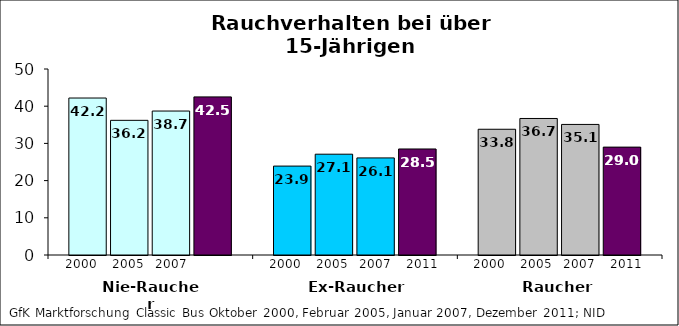
| Category | 2000 | 2005 | 2007 | 2011 |
|---|---|---|---|---|
| Nie-Raucher | 42.2 | 36.2 | 38.7 | 42.5 |
| Ex-Raucher | 23.9 | 27.1 | 26.1 | 28.5 |
| Raucher | 33.8 | 36.7 | 35.1 | 29 |